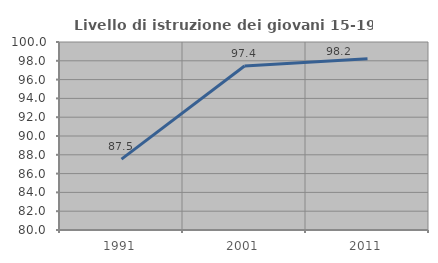
| Category | Livello di istruzione dei giovani 15-19 anni |
|---|---|
| 1991.0 | 87.543 |
| 2001.0 | 97.449 |
| 2011.0 | 98.225 |